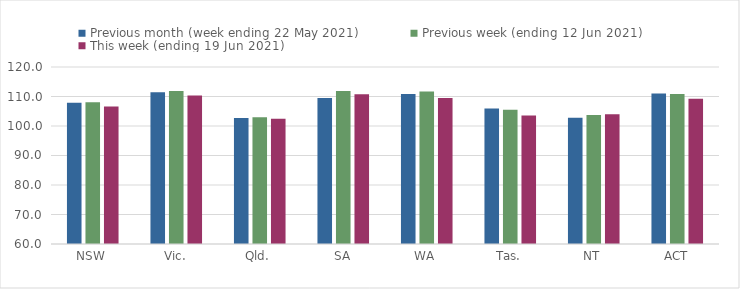
| Category | Previous month (week ending 22 May 2021) | Previous week (ending 12 Jun 2021) | This week (ending 19 Jun 2021) |
|---|---|---|---|
| NSW | 107.87 | 108.06 | 106.64 |
| Vic. | 111.44 | 111.86 | 110.3 |
| Qld. | 102.7 | 102.99 | 102.43 |
| SA | 109.48 | 111.83 | 110.79 |
| WA | 110.83 | 111.66 | 109.5 |
| Tas. | 105.9 | 105.49 | 103.57 |
| NT | 102.82 | 103.71 | 103.97 |
| ACT | 110.98 | 110.87 | 109.25 |